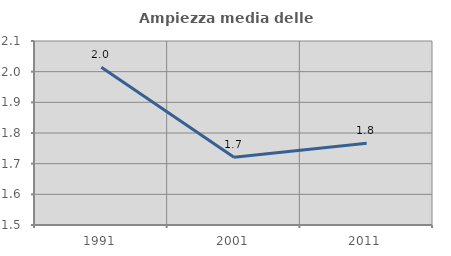
| Category | Ampiezza media delle famiglie |
|---|---|
| 1991.0 | 2.014 |
| 2001.0 | 1.721 |
| 2011.0 | 1.767 |